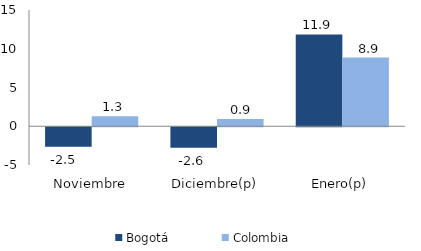
| Category | Bogotá | Colombia |
|---|---|---|
| Noviembre | -2.518 | 1.282 |
| Diciembre(p) | -2.635 | 0.93 |
| Enero(p) | 11.855 | 8.856 |